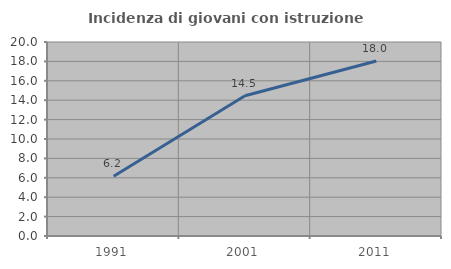
| Category | Incidenza di giovani con istruzione universitaria |
|---|---|
| 1991.0 | 6.167 |
| 2001.0 | 14.452 |
| 2011.0 | 18.038 |